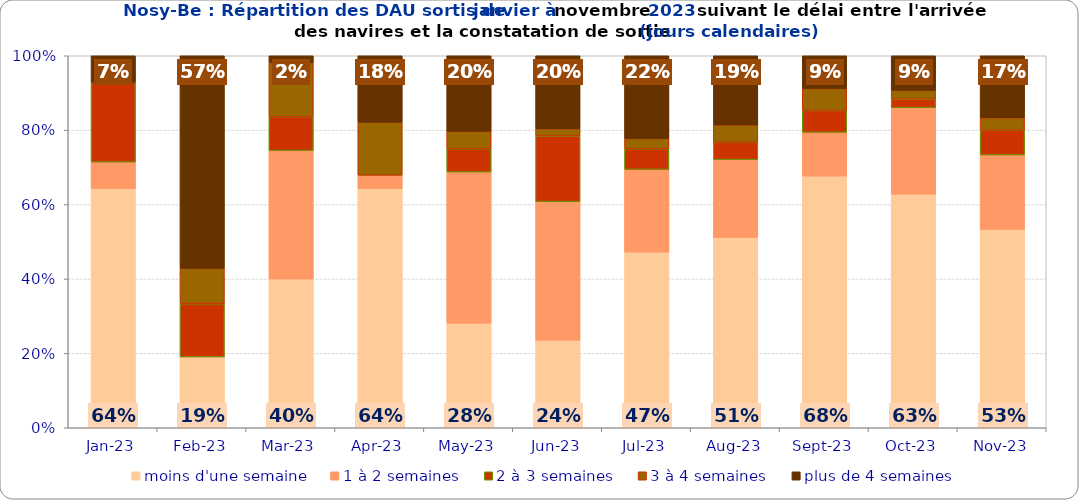
| Category | moins d'une semaine | 1 à 2 semaines | 2 à 3 semaines | 3 à 4 semaines | plus de 4 semaines |
|---|---|---|---|---|---|
| 2023-01-01 | 0.643 | 0.071 | 0.214 | 0 | 0.071 |
| 2023-02-01 | 0.19 | 0 | 0.143 | 0.095 | 0.571 |
| 2023-03-01 | 0.4 | 0.345 | 0.091 | 0.145 | 0.018 |
| 2023-04-01 | 0.643 | 0.036 | 0 | 0.143 | 0.179 |
| 2023-05-01 | 0.281 | 0.406 | 0.062 | 0.047 | 0.203 |
| 2023-06-01 | 0.235 | 0.373 | 0.176 | 0.02 | 0.196 |
| 2023-07-01 | 0.472 | 0.222 | 0.056 | 0.028 | 0.222 |
| 2023-08-01 | 0.512 | 0.209 | 0.047 | 0.047 | 0.186 |
| 2023-09-01 | 0.676 | 0.118 | 0.059 | 0.059 | 0.088 |
| 2023-10-01 | 0.628 | 0.233 | 0.023 | 0.023 | 0.093 |
| 2023-11-01 | 0.533 | 0.2 | 0.067 | 0.033 | 0.167 |